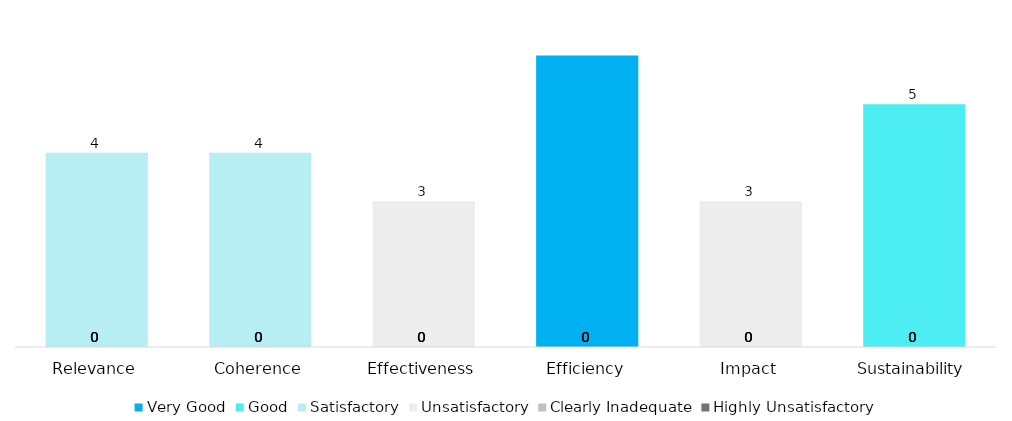
| Category | Very Good | Good | Satisfactory | Unsatisfactory | Clearly Inadequate | Highly Unsatisfactory |
|---|---|---|---|---|---|---|
| Relevance | 0 | 0 | 4 | 0 | 0 | 0 |
| Coherence | 0 | 0 | 4 | 0 | 0 | 0 |
| Effectiveness | 0 | 0 | 0 | 3 | 0 | 0 |
| Efficiency | 6 | 0 | 0 | 0 | 0 | 0 |
| Impact | 0 | 0 | 0 | 3 | 0 | 0 |
| Sustainability | 0 | 5 | 0 | 0 | 0 | 0 |